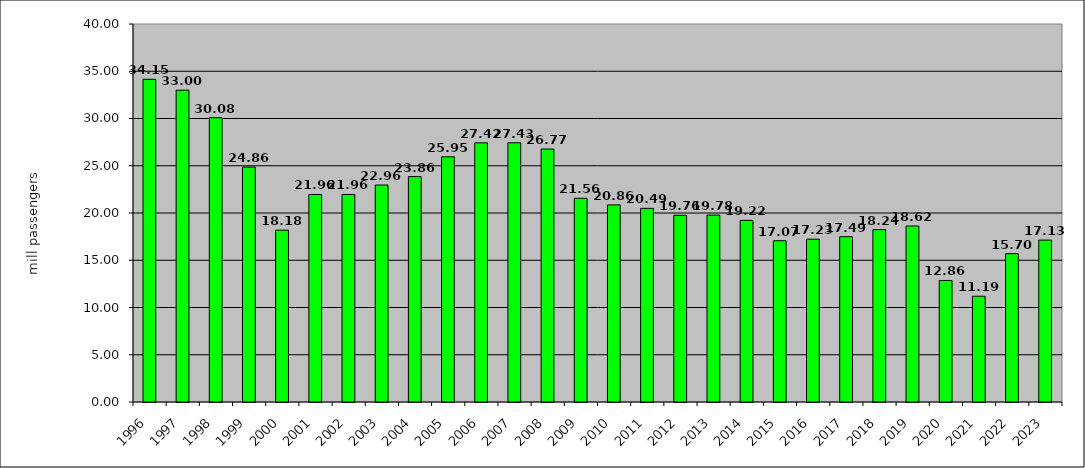
| Category | Series 0 |
|---|---|
| 1996.0 | 34.147 |
| 1997.0 | 32.995 |
| 1998.0 | 30.084 |
| 1999.0 | 24.861 |
| 2000.0 | 18.184 |
| 2001.0 | 21.959 |
| 2002.0 | 21.959 |
| 2003.0 | 22.96 |
| 2004.0 | 23.855 |
| 2005.0 | 25.948 |
| 2006.0 | 27.421 |
| 2007.0 | 27.43 |
| 2008.0 | 26.767 |
| 2009.0 | 21.556 |
| 2010.0 | 20.857 |
| 2011.0 | 20.492 |
| 2012.0 | 19.757 |
| 2013.0 | 19.78 |
| 2014.0 | 19.222 |
| 2015.0 | 17.07 |
| 2016.0 | 17.228 |
| 2017.0 | 17.493 |
| 2018.0 | 18.241 |
| 2019.0 | 18.624 |
| 2020.0 | 12.862 |
| 2021.0 | 11.193 |
| 2022.0 | 15.695 |
| 2023.0 | 17.132 |